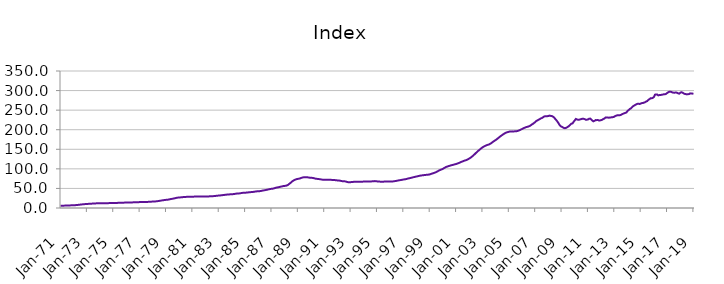
| Category | Index |
|---|---|
| 1971-01-01 | 5.879 |
| 1971-02-01 | 5.921 |
| 1971-03-01 | 5.963 |
| 1971-04-01 | 6.018 |
| 1971-05-01 | 6.108 |
| 1971-06-01 | 6.203 |
| 1971-07-01 | 6.32 |
| 1971-08-01 | 6.446 |
| 1971-09-01 | 6.572 |
| 1971-10-01 | 6.703 |
| 1971-11-01 | 6.844 |
| 1971-12-01 | 7.015 |
| 1972-01-01 | 7.135 |
| 1972-02-01 | 7.213 |
| 1972-03-01 | 7.39 |
| 1972-04-01 | 7.638 |
| 1972-05-01 | 7.997 |
| 1972-06-01 | 8.312 |
| 1972-07-01 | 8.674 |
| 1972-08-01 | 9.023 |
| 1972-09-01 | 9.332 |
| 1972-10-01 | 9.62 |
| 1972-11-01 | 9.887 |
| 1972-12-01 | 10.162 |
| 1973-01-01 | 10.359 |
| 1973-02-01 | 10.498 |
| 1973-03-01 | 10.658 |
| 1973-04-01 | 10.841 |
| 1973-05-01 | 11.075 |
| 1973-06-01 | 11.227 |
| 1973-07-01 | 11.386 |
| 1973-08-01 | 11.562 |
| 1973-09-01 | 11.768 |
| 1973-10-01 | 11.982 |
| 1973-11-01 | 12.145 |
| 1973-12-01 | 12.262 |
| 1974-01-01 | 12.324 |
| 1974-02-01 | 12.392 |
| 1974-03-01 | 12.389 |
| 1974-04-01 | 12.362 |
| 1974-05-01 | 12.339 |
| 1974-06-01 | 12.34 |
| 1974-07-01 | 12.352 |
| 1974-08-01 | 12.392 |
| 1974-09-01 | 12.465 |
| 1974-10-01 | 12.555 |
| 1974-11-01 | 12.63 |
| 1974-12-01 | 12.703 |
| 1975-01-01 | 12.737 |
| 1975-02-01 | 12.78 |
| 1975-03-01 | 12.857 |
| 1975-04-01 | 12.965 |
| 1975-05-01 | 13.097 |
| 1975-06-01 | 13.168 |
| 1975-07-01 | 13.237 |
| 1975-08-01 | 13.332 |
| 1975-09-01 | 13.462 |
| 1975-10-01 | 13.606 |
| 1975-11-01 | 13.732 |
| 1975-12-01 | 13.867 |
| 1976-01-01 | 13.963 |
| 1976-02-01 | 14.052 |
| 1976-03-01 | 14.114 |
| 1976-04-01 | 14.179 |
| 1976-05-01 | 14.264 |
| 1976-06-01 | 14.32 |
| 1976-07-01 | 14.382 |
| 1976-08-01 | 14.474 |
| 1976-09-01 | 14.605 |
| 1976-10-01 | 14.752 |
| 1976-11-01 | 14.87 |
| 1976-12-01 | 14.976 |
| 1977-01-01 | 15.034 |
| 1977-02-01 | 15.102 |
| 1977-03-01 | 15.145 |
| 1977-04-01 | 15.197 |
| 1977-05-01 | 15.276 |
| 1977-06-01 | 15.347 |
| 1977-07-01 | 15.436 |
| 1977-08-01 | 15.557 |
| 1977-09-01 | 15.705 |
| 1977-10-01 | 15.871 |
| 1977-11-01 | 16.048 |
| 1977-12-01 | 16.278 |
| 1978-01-01 | 16.449 |
| 1978-02-01 | 16.582 |
| 1978-03-01 | 16.762 |
| 1978-04-01 | 17.003 |
| 1978-05-01 | 17.391 |
| 1978-06-01 | 17.783 |
| 1978-07-01 | 18.258 |
| 1978-08-01 | 18.744 |
| 1978-09-01 | 19.213 |
| 1978-10-01 | 19.678 |
| 1978-11-01 | 20.113 |
| 1978-12-01 | 20.542 |
| 1979-01-01 | 20.797 |
| 1979-02-01 | 20.968 |
| 1979-03-01 | 21.394 |
| 1979-04-01 | 21.979 |
| 1979-05-01 | 22.725 |
| 1979-06-01 | 23.198 |
| 1979-07-01 | 23.69 |
| 1979-08-01 | 24.243 |
| 1979-09-01 | 24.906 |
| 1979-10-01 | 25.613 |
| 1979-11-01 | 26.202 |
| 1979-12-01 | 26.66 |
| 1980-01-01 | 26.911 |
| 1980-02-01 | 27.107 |
| 1980-03-01 | 27.357 |
| 1980-04-01 | 27.651 |
| 1980-05-01 | 27.994 |
| 1980-06-01 | 28.178 |
| 1980-07-01 | 28.344 |
| 1980-08-01 | 28.498 |
| 1980-09-01 | 28.607 |
| 1980-10-01 | 28.676 |
| 1980-11-01 | 28.73 |
| 1980-12-01 | 28.843 |
| 1981-01-01 | 28.911 |
| 1981-02-01 | 29.013 |
| 1981-03-01 | 29.116 |
| 1981-04-01 | 29.254 |
| 1981-05-01 | 29.394 |
| 1981-06-01 | 29.441 |
| 1981-07-01 | 29.464 |
| 1981-08-01 | 29.469 |
| 1981-09-01 | 29.414 |
| 1981-10-01 | 29.312 |
| 1981-11-01 | 29.219 |
| 1981-12-01 | 29.209 |
| 1982-01-01 | 29.164 |
| 1982-02-01 | 29.184 |
| 1982-03-01 | 29.346 |
| 1982-04-01 | 29.618 |
| 1982-05-01 | 29.924 |
| 1982-06-01 | 30.035 |
| 1982-07-01 | 30.119 |
| 1982-08-01 | 30.28 |
| 1982-09-01 | 30.54 |
| 1982-10-01 | 30.849 |
| 1982-11-01 | 31.157 |
| 1982-12-01 | 31.538 |
| 1983-01-01 | 31.828 |
| 1983-02-01 | 32.078 |
| 1983-03-01 | 32.337 |
| 1983-04-01 | 32.659 |
| 1983-05-01 | 33.081 |
| 1983-06-01 | 33.413 |
| 1983-07-01 | 33.773 |
| 1983-08-01 | 34.116 |
| 1983-09-01 | 34.39 |
| 1983-10-01 | 34.614 |
| 1983-11-01 | 34.826 |
| 1983-12-01 | 35.104 |
| 1984-01-01 | 35.27 |
| 1984-02-01 | 35.438 |
| 1984-03-01 | 35.758 |
| 1984-04-01 | 36.202 |
| 1984-05-01 | 36.71 |
| 1984-06-01 | 36.936 |
| 1984-07-01 | 37.124 |
| 1984-08-01 | 37.411 |
| 1984-09-01 | 37.87 |
| 1984-10-01 | 38.4 |
| 1984-11-01 | 38.81 |
| 1984-12-01 | 39.095 |
| 1985-01-01 | 39.174 |
| 1985-02-01 | 39.283 |
| 1985-03-01 | 39.552 |
| 1985-04-01 | 39.93 |
| 1985-05-01 | 40.361 |
| 1985-06-01 | 40.527 |
| 1985-07-01 | 40.681 |
| 1985-08-01 | 40.948 |
| 1985-09-01 | 41.393 |
| 1985-10-01 | 41.902 |
| 1985-11-01 | 42.329 |
| 1985-12-01 | 42.671 |
| 1986-01-01 | 42.803 |
| 1986-02-01 | 42.939 |
| 1986-03-01 | 43.335 |
| 1986-04-01 | 43.908 |
| 1986-05-01 | 44.624 |
| 1986-06-01 | 45.057 |
| 1986-07-01 | 45.499 |
| 1986-08-01 | 46.028 |
| 1986-09-01 | 46.692 |
| 1986-10-01 | 47.409 |
| 1986-11-01 | 48.06 |
| 1986-12-01 | 48.667 |
| 1987-01-01 | 49.02 |
| 1987-02-01 | 49.311 |
| 1987-03-01 | 49.944 |
| 1987-04-01 | 50.795 |
| 1987-05-01 | 51.813 |
| 1987-06-01 | 52.387 |
| 1987-07-01 | 52.937 |
| 1987-08-01 | 53.541 |
| 1987-09-01 | 54.197 |
| 1987-10-01 | 54.877 |
| 1987-11-01 | 55.513 |
| 1987-12-01 | 56.172 |
| 1988-01-01 | 56.486 |
| 1988-02-01 | 56.756 |
| 1988-03-01 | 57.701 |
| 1988-04-01 | 59.124 |
| 1988-05-01 | 61.264 |
| 1988-06-01 | 63.424 |
| 1988-07-01 | 65.968 |
| 1988-08-01 | 68.307 |
| 1988-09-01 | 70.109 |
| 1988-10-01 | 71.604 |
| 1988-11-01 | 72.807 |
| 1988-12-01 | 73.875 |
| 1989-01-01 | 74.434 |
| 1989-02-01 | 74.906 |
| 1989-03-01 | 75.707 |
| 1989-04-01 | 76.727 |
| 1989-05-01 | 77.807 |
| 1989-06-01 | 78.279 |
| 1989-07-01 | 78.601 |
| 1989-08-01 | 78.752 |
| 1989-09-01 | 78.622 |
| 1989-10-01 | 78.258 |
| 1989-11-01 | 77.774 |
| 1989-12-01 | 77.38 |
| 1990-01-01 | 77.025 |
| 1990-02-01 | 77.011 |
| 1990-03-01 | 76.482 |
| 1990-04-01 | 75.796 |
| 1990-05-01 | 74.994 |
| 1990-06-01 | 74.611 |
| 1990-07-01 | 74.285 |
| 1990-08-01 | 73.967 |
| 1990-09-01 | 73.52 |
| 1990-10-01 | 73.009 |
| 1990-11-01 | 72.535 |
| 1990-12-01 | 72.334 |
| 1991-01-01 | 72.192 |
| 1991-02-01 | 72.268 |
| 1991-03-01 | 72.153 |
| 1991-04-01 | 72.077 |
| 1991-05-01 | 71.977 |
| 1991-06-01 | 71.933 |
| 1991-07-01 | 71.885 |
| 1991-08-01 | 71.819 |
| 1991-09-01 | 71.705 |
| 1991-10-01 | 71.501 |
| 1991-11-01 | 71.166 |
| 1991-12-01 | 70.813 |
| 1992-01-01 | 70.463 |
| 1992-02-01 | 70.409 |
| 1992-03-01 | 69.918 |
| 1992-04-01 | 69.325 |
| 1992-05-01 | 68.671 |
| 1992-06-01 | 68.457 |
| 1992-07-01 | 68.303 |
| 1992-08-01 | 67.98 |
| 1992-09-01 | 67.29 |
| 1992-10-01 | 66.434 |
| 1992-11-01 | 65.854 |
| 1992-12-01 | 65.871 |
| 1993-01-01 | 66.034 |
| 1993-02-01 | 66.322 |
| 1993-03-01 | 66.581 |
| 1993-04-01 | 66.905 |
| 1993-05-01 | 67.182 |
| 1993-06-01 | 67.213 |
| 1993-07-01 | 67.233 |
| 1993-08-01 | 67.289 |
| 1993-09-01 | 67.247 |
| 1993-10-01 | 67.126 |
| 1993-11-01 | 67.046 |
| 1993-12-01 | 67.281 |
| 1994-01-01 | 67.604 |
| 1994-02-01 | 68.006 |
| 1994-03-01 | 67.991 |
| 1994-04-01 | 67.827 |
| 1994-05-01 | 67.683 |
| 1994-06-01 | 67.696 |
| 1994-07-01 | 67.777 |
| 1994-08-01 | 67.944 |
| 1994-09-01 | 68.21 |
| 1994-10-01 | 68.532 |
| 1994-11-01 | 68.685 |
| 1994-12-01 | 68.595 |
| 1995-01-01 | 68.092 |
| 1995-02-01 | 67.66 |
| 1995-03-01 | 67.497 |
| 1995-04-01 | 67.327 |
| 1995-05-01 | 67.356 |
| 1995-06-01 | 67.213 |
| 1995-07-01 | 67.36 |
| 1995-08-01 | 67.425 |
| 1995-09-01 | 67.463 |
| 1995-10-01 | 67.439 |
| 1995-11-01 | 67.524 |
| 1995-12-01 | 67.607 |
| 1996-01-01 | 67.632 |
| 1996-02-01 | 67.59 |
| 1996-03-01 | 67.814 |
| 1996-04-01 | 68.077 |
| 1996-05-01 | 68.578 |
| 1996-06-01 | 68.945 |
| 1996-07-01 | 69.543 |
| 1996-08-01 | 70.122 |
| 1996-09-01 | 70.708 |
| 1996-10-01 | 71.134 |
| 1996-11-01 | 71.585 |
| 1996-12-01 | 72.224 |
| 1997-01-01 | 72.682 |
| 1997-02-01 | 73.17 |
| 1997-03-01 | 73.587 |
| 1997-04-01 | 74.264 |
| 1997-05-01 | 75.148 |
| 1997-06-01 | 75.819 |
| 1997-07-01 | 76.292 |
| 1997-08-01 | 77.048 |
| 1997-09-01 | 77.723 |
| 1997-10-01 | 78.598 |
| 1997-11-01 | 79.21 |
| 1997-12-01 | 79.988 |
| 1998-01-01 | 80.449 |
| 1998-02-01 | 81.141 |
| 1998-03-01 | 81.745 |
| 1998-04-01 | 82.495 |
| 1998-05-01 | 83.027 |
| 1998-06-01 | 83.355 |
| 1998-07-01 | 83.747 |
| 1998-08-01 | 84.113 |
| 1998-09-01 | 84.484 |
| 1998-10-01 | 84.731 |
| 1998-11-01 | 85.018 |
| 1998-12-01 | 85.363 |
| 1999-01-01 | 85.875 |
| 1999-02-01 | 86.896 |
| 1999-03-01 | 87.796 |
| 1999-04-01 | 88.688 |
| 1999-05-01 | 89.666 |
| 1999-06-01 | 90.701 |
| 1999-07-01 | 91.918 |
| 1999-08-01 | 93.495 |
| 1999-09-01 | 95.101 |
| 1999-10-01 | 96.577 |
| 1999-11-01 | 97.58 |
| 1999-12-01 | 98.926 |
| 2000-01-01 | 100 |
| 2000-02-01 | 101.936 |
| 2000-03-01 | 103.455 |
| 2000-04-01 | 105.075 |
| 2000-05-01 | 105.895 |
| 2000-06-01 | 106.901 |
| 2000-07-01 | 107.798 |
| 2000-08-01 | 108.633 |
| 2000-09-01 | 109.409 |
| 2000-10-01 | 110.207 |
| 2000-11-01 | 110.863 |
| 2000-12-01 | 111.699 |
| 2001-01-01 | 112.376 |
| 2001-02-01 | 113.427 |
| 2001-03-01 | 114.41 |
| 2001-04-01 | 115.617 |
| 2001-05-01 | 116.92 |
| 2001-06-01 | 118 |
| 2001-07-01 | 119.178 |
| 2001-08-01 | 120.352 |
| 2001-09-01 | 121.415 |
| 2001-10-01 | 122.129 |
| 2001-11-01 | 123.346 |
| 2001-12-01 | 124.695 |
| 2002-01-01 | 126.498 |
| 2002-02-01 | 128.249 |
| 2002-03-01 | 130.341 |
| 2002-04-01 | 132.594 |
| 2002-05-01 | 135.137 |
| 2002-06-01 | 137.714 |
| 2002-07-01 | 140.534 |
| 2002-08-01 | 143.04 |
| 2002-09-01 | 145.7 |
| 2002-10-01 | 148.191 |
| 2002-11-01 | 150.379 |
| 2002-12-01 | 152.788 |
| 2003-01-01 | 154.938 |
| 2003-02-01 | 156.702 |
| 2003-03-01 | 158.127 |
| 2003-04-01 | 159.492 |
| 2003-05-01 | 160.649 |
| 2003-06-01 | 161.58 |
| 2003-07-01 | 162.401 |
| 2003-08-01 | 164.014 |
| 2003-09-01 | 165.699 |
| 2003-10-01 | 167.901 |
| 2003-11-01 | 170.039 |
| 2003-12-01 | 171.829 |
| 2004-01-01 | 173.609 |
| 2004-02-01 | 175.589 |
| 2004-03-01 | 177.991 |
| 2004-04-01 | 180.138 |
| 2004-05-01 | 182.465 |
| 2004-06-01 | 184.54 |
| 2004-07-01 | 186.551 |
| 2004-08-01 | 188.625 |
| 2004-09-01 | 190.257 |
| 2004-10-01 | 192.019 |
| 2004-11-01 | 192.962 |
| 2004-12-01 | 193.904 |
| 2005-01-01 | 194.627 |
| 2005-02-01 | 195.72 |
| 2005-03-01 | 195.655 |
| 2005-04-01 | 195.754 |
| 2005-05-01 | 195.194 |
| 2005-06-01 | 195.793 |
| 2005-07-01 | 195.867 |
| 2005-08-01 | 196.175 |
| 2005-09-01 | 196.736 |
| 2005-10-01 | 197.938 |
| 2005-11-01 | 198.884 |
| 2005-12-01 | 200.645 |
| 2006-01-01 | 201.661 |
| 2006-02-01 | 203.374 |
| 2006-03-01 | 204.511 |
| 2006-04-01 | 205.861 |
| 2006-05-01 | 206.826 |
| 2006-06-01 | 207.511 |
| 2006-07-01 | 208.388 |
| 2006-08-01 | 209.567 |
| 2006-09-01 | 211.353 |
| 2006-10-01 | 213.443 |
| 2006-11-01 | 215.14 |
| 2006-12-01 | 217.475 |
| 2007-01-01 | 219.496 |
| 2007-02-01 | 222.231 |
| 2007-03-01 | 223.7 |
| 2007-04-01 | 225.58 |
| 2007-05-01 | 226.869 |
| 2007-06-01 | 228.812 |
| 2007-07-01 | 229.701 |
| 2007-08-01 | 231.63 |
| 2007-09-01 | 233.384 |
| 2007-10-01 | 234.664 |
| 2007-11-01 | 234.312 |
| 2007-12-01 | 234.555 |
| 2008-01-01 | 235.086 |
| 2008-02-01 | 236.026 |
| 2008-03-01 | 235.364 |
| 2008-04-01 | 234.965 |
| 2008-05-01 | 233.6 |
| 2008-06-01 | 231.702 |
| 2008-07-01 | 228.29 |
| 2008-08-01 | 225.152 |
| 2008-09-01 | 221.485 |
| 2008-10-01 | 217.485 |
| 2008-11-01 | 212.758 |
| 2008-12-01 | 209.323 |
| 2009-01-01 | 207.652 |
| 2009-02-01 | 206.212 |
| 2009-03-01 | 204.576 |
| 2009-04-01 | 203.86 |
| 2009-05-01 | 204.572 |
| 2009-06-01 | 206.247 |
| 2009-07-01 | 207.906 |
| 2009-08-01 | 210.209 |
| 2009-09-01 | 213.072 |
| 2009-10-01 | 215.548 |
| 2009-11-01 | 216.169 |
| 2009-12-01 | 220.435 |
| 2010-01-01 | 223.882 |
| 2010-02-01 | 227.544 |
| 2010-03-01 | 226.207 |
| 2010-04-01 | 225.371 |
| 2010-05-01 | 225.616 |
| 2010-06-01 | 226.496 |
| 2010-07-01 | 227.242 |
| 2010-08-01 | 228.031 |
| 2010-09-01 | 227.934 |
| 2010-10-01 | 227.086 |
| 2010-11-01 | 225.565 |
| 2010-12-01 | 225.597 |
| 2011-01-01 | 226.214 |
| 2011-02-01 | 228.039 |
| 2011-03-01 | 228.503 |
| 2011-04-01 | 226.162 |
| 2011-05-01 | 223.102 |
| 2011-06-01 | 221.419 |
| 2011-07-01 | 222.781 |
| 2011-08-01 | 224.513 |
| 2011-09-01 | 224.472 |
| 2011-10-01 | 224.841 |
| 2011-11-01 | 223.579 |
| 2011-12-01 | 223.822 |
| 2012-01-01 | 224.584 |
| 2012-02-01 | 225.473 |
| 2012-03-01 | 227.466 |
| 2012-04-01 | 228.575 |
| 2012-05-01 | 231.11 |
| 2012-06-01 | 231.251 |
| 2012-07-01 | 231.282 |
| 2012-08-01 | 230.612 |
| 2012-09-01 | 231.126 |
| 2012-10-01 | 231.503 |
| 2012-11-01 | 231.747 |
| 2012-12-01 | 232.346 |
| 2013-01-01 | 233.26 |
| 2013-02-01 | 235.199 |
| 2013-03-01 | 236.287 |
| 2013-04-01 | 236.897 |
| 2013-05-01 | 236.822 |
| 2013-06-01 | 237.016 |
| 2013-07-01 | 237.888 |
| 2013-08-01 | 239.493 |
| 2013-09-01 | 240.786 |
| 2013-10-01 | 242.115 |
| 2013-11-01 | 242.898 |
| 2013-12-01 | 244.057 |
| 2014-01-01 | 247.816 |
| 2014-02-01 | 250.169 |
| 2014-03-01 | 252.769 |
| 2014-04-01 | 254.326 |
| 2014-05-01 | 257.246 |
| 2014-06-01 | 260.069 |
| 2014-07-01 | 261.53 |
| 2014-08-01 | 263.472 |
| 2014-09-01 | 264.905 |
| 2014-10-01 | 266.07 |
| 2014-11-01 | 266.347 |
| 2014-12-01 | 265.659 |
| 2015-01-01 | 266.928 |
| 2015-02-01 | 267.88 |
| 2015-03-01 | 268.307 |
| 2015-04-01 | 269.155 |
| 2015-05-01 | 270.34 |
| 2015-06-01 | 272.163 |
| 2015-07-01 | 273.277 |
| 2015-08-01 | 276.288 |
| 2015-09-01 | 278.116 |
| 2015-10-01 | 280.486 |
| 2015-11-01 | 280.294 |
| 2015-12-01 | 281.199 |
| 2016-01-01 | 283.607 |
| 2016-02-01 | 289.619 |
| 2016-03-01 | 290.057 |
| 2016-04-01 | 289.886 |
| 2016-05-01 | 287.681 |
| 2016-06-01 | 288.483 |
| 2016-07-01 | 288.661 |
| 2016-08-01 | 289.259 |
| 2016-09-01 | 289.711 |
| 2016-10-01 | 290.701 |
| 2016-11-01 | 290.463 |
| 2016-12-01 | 291.375 |
| 2017-01-01 | 293.717 |
| 2017-02-01 | 295.456 |
| 2017-03-01 | 297.078 |
| 2017-04-01 | 296.912 |
| 2017-05-01 | 296.553 |
| 2017-06-01 | 295.078 |
| 2017-07-01 | 294.677 |
| 2017-08-01 | 294.669 |
| 2017-09-01 | 295.305 |
| 2017-10-01 | 294.345 |
| 2017-11-01 | 293.162 |
| 2017-12-01 | 292.069 |
| 2018-01-01 | 294.449 |
| 2018-02-01 | 295.846 |
| 2018-03-01 | 294.92 |
| 2018-04-01 | 292.924 |
| 2018-05-01 | 291.472 |
| 2018-06-01 | 291.002 |
| 2018-07-01 | 290.236 |
| 2018-08-01 | 290.758 |
| 2018-09-01 | 291.058 |
| 2018-10-01 | 292.824 |
| 2018-11-01 | 292.65 |
| 2018-12-01 | 292.367 |
| 2019-01-01 | 291.845 |